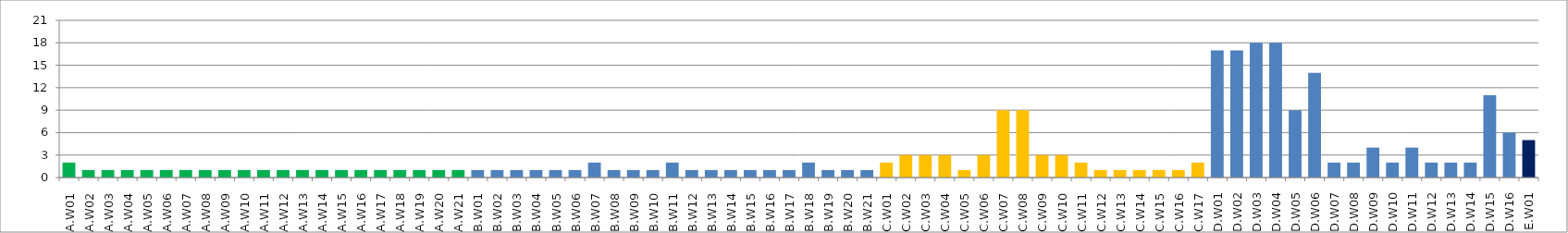
| Category | Series 0 |
|---|---|
| A.W01 | 2 |
| A.W02 | 1 |
| A.W03 | 1 |
| A.W04 | 1 |
| A.W05 | 1 |
| A.W06 | 1 |
| A.W07 | 1 |
| A.W08 | 1 |
| A.W09 | 1 |
| A.W10 | 1 |
| A.W11 | 1 |
| A.W12 | 1 |
| A.W13 | 1 |
| A.W14 | 1 |
| A.W15 | 1 |
| A.W16 | 1 |
| A.W17 | 1 |
| A.W18 | 1 |
| A.W19 | 1 |
| A.W20 | 1 |
| A.W21 | 1 |
| B.W01 | 1 |
| B.W02 | 1 |
| B.W03 | 1 |
| B.W04 | 1 |
| B.W05 | 1 |
| B.W06 | 1 |
| B.W07 | 2 |
| B.W08 | 1 |
| B.W09 | 1 |
| B.W10 | 1 |
| B.W11 | 2 |
| B.W12 | 1 |
| B.W13 | 1 |
| B.W14 | 1 |
| B.W15 | 1 |
| B.W16 | 1 |
| B.W17 | 1 |
| B.W18 | 2 |
| B.W19 | 1 |
| B.W20 | 1 |
| B.W21 | 1 |
| C.W01 | 2 |
| C.W02 | 3 |
| C.W03 | 3 |
| C.W04 | 3 |
| C.W05 | 1 |
| C.W06 | 3 |
| C.W07 | 9 |
| C.W08 | 9 |
| C.W09 | 3 |
| C.W10 | 3 |
| C.W11 | 2 |
| C.W12 | 1 |
| C.W13 | 1 |
| C.W14 | 1 |
| C.W15 | 1 |
| C.W16 | 1 |
| C.W17 | 2 |
| D.W01 | 17 |
| D.W02 | 17 |
| D.W03 | 18 |
| D.W04 | 18 |
| D.W05 | 9 |
| D.W06 | 14 |
| D.W07 | 2 |
| D.W08 | 2 |
| D.W09 | 4 |
| D.W10 | 2 |
| D.W11 | 4 |
| D.W12 | 2 |
| D.W13 | 2 |
| D.W14 | 2 |
| D.W15 | 11 |
| D.W16 | 6 |
| E.W01 | 5 |